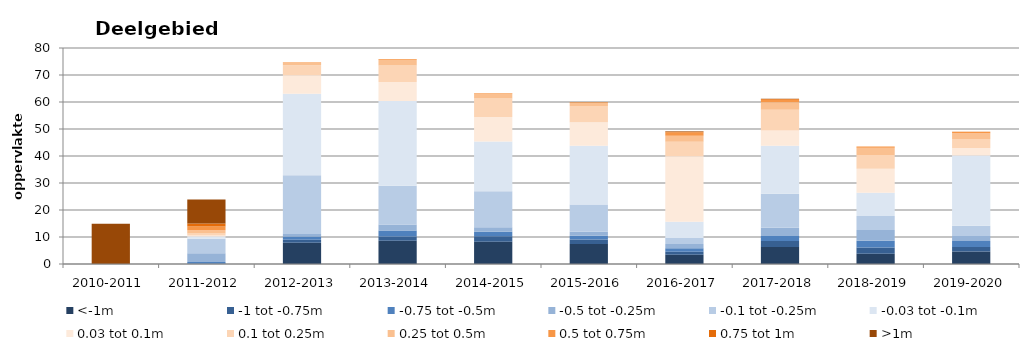
| Category | <-1m | -1 tot -0.75m | -0.75 tot -0.5m | -0.5 tot -0.25m | -0.1 tot -0.25m | -0.03 tot -0.1m | 0.03 tot 0.1m | 0.1 tot 0.25m | 0.25 tot 0.5m | 0.5 tot 0.75m | 0.75 tot 1m | >1m |
|---|---|---|---|---|---|---|---|---|---|---|---|---|
| 2010-2011 | 0 | 0 | 0 | 0 | 0 | 0 | 0 | 0 | 0 | 0 | 0 | 14.907 |
| 2011-2012 | 0.002 | 0.186 | 0.55 | 3.251 | 5.352 | 0.819 | 0.413 | 0.684 | 1.246 | 1.342 | 1.146 | 8.869 |
| 2012-2013 | 7.839 | 1.109 | 1.193 | 0.983 | 21.745 | 30.143 | 6.934 | 3.654 | 0.922 | 0.16 | 0.06 | 0.008 |
| 2013-2014 | 8.625 | 1.606 | 2.152 | 2.238 | 14.376 | 31.378 | 7.018 | 6.131 | 2.144 | 0.229 | 0.025 | 0 |
| 2014-2015 | 8.269 | 1.988 | 1.67 | 1.719 | 13.288 | 18.477 | 9.049 | 6.864 | 1.82 | 0.217 | 0.001 | 0 |
| 2015-2016 | 7.393 | 1.695 | 1.367 | 1.443 | 10.124 | 21.744 | 8.688 | 6.105 | 1.034 | 0.263 | 0.028 | 0 |
| 2016-2017 | 3.393 | 1.154 | 1.285 | 1.596 | 2.184 | 6.051 | 24.252 | 5.335 | 2.265 | 1.166 | 0.288 | 0.19 |
| 2017-2018 | 6.317 | 2.207 | 1.848 | 3.032 | 12.65 | 17.761 | 5.59 | 7.732 | 2.746 | 0.994 | 0.267 | 0.046 |
| 2018-2019 | 3.838 | 2.28 | 2.49 | 3.948 | 5.208 | 8.613 | 8.868 | 5.154 | 2.662 | 0.421 | 0.048 | 0.004 |
| 2019-2020 | 4.65 | 1.685 | 2.164 | 1.849 | 3.836 | 26.042 | 2.698 | 3.374 | 2.152 | 0.446 | 0.052 | 0.007 |